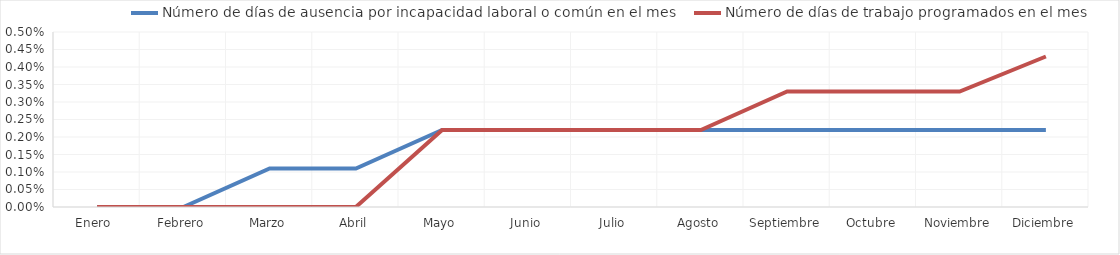
| Category | Número de días de ausencia por incapacidad laboral o común en el mes | Número de días de trabajo programados en el mes |
|---|---|---|
| Enero  | 0 | 0 |
| Febrero | 0 | 0 |
| Marzo | 0.001 | 0 |
| Abril | 0.001 | 0 |
| Mayo | 0.002 | 0.002 |
| Junio | 0.002 | 0.002 |
| Julio | 0.002 | 0.002 |
| Agosto | 0.002 | 0.002 |
| Septiembre | 0.002 | 0.003 |
| Octubre | 0.002 | 0.003 |
| Noviembre | 0.002 | 0.003 |
| Diciembre | 0.002 | 0.004 |